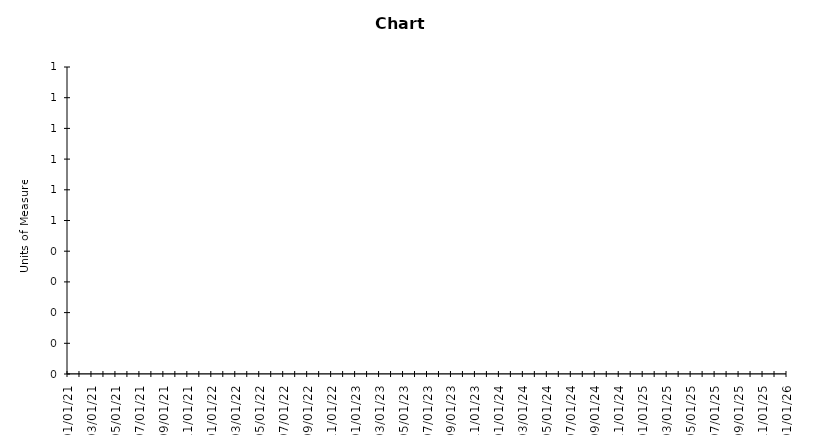
| Category | Data | Target |
|---|---|---|
| 2021-01-01 |  | 0 |
| 2021-02-01 |  | 0 |
| 2021-03-01 |  | 0 |
| 2021-04-01 |  | 0 |
| 2021-05-01 |  | 0 |
| 2021-06-01 |  | 0 |
| 2021-07-01 |  | 0 |
| 2021-08-01 |  | 0 |
| 2021-09-01 |  | 0 |
| 2021-10-01 |  | 0 |
| 2021-11-01 |  | 0 |
| 2021-12-01 |  | 0 |
| 2022-01-01 |  | 0 |
| 2022-02-01 |  | 0 |
| 2022-03-01 |  | 0 |
| 2022-04-01 |  | 0 |
| 2022-05-01 |  | 0 |
| 2022-06-01 |  | 0 |
| 2022-07-01 |  | 0 |
| 2022-08-01 |  | 0 |
| 2022-09-01 |  | 0 |
| 2022-10-01 |  | 0 |
| 2022-11-01 |  | 0 |
| 2022-12-01 |  | 0 |
| 2023-01-01 |  | 0 |
| 2023-02-01 |  | 0 |
| 2023-03-01 |  | 0 |
| 2023-04-01 |  | 0 |
| 2023-05-01 |  | 0 |
| 2023-06-01 |  | 0 |
| 2023-07-01 |  | 0 |
| 2023-08-01 |  | 0 |
| 2023-09-01 |  | 0 |
| 2023-10-01 |  | 0 |
| 2023-11-01 |  | 0 |
| 2023-12-01 |  | 0 |
| 2024-01-01 |  | 0 |
| 2024-02-01 |  | 0 |
| 2024-03-01 |  | 0 |
| 2024-04-01 |  | 0 |
| 2024-05-01 |  | 0 |
| 2024-06-01 |  | 0 |
| 2024-07-01 |  | 0 |
| 2024-08-01 |  | 0 |
| 2024-09-01 |  | 0 |
| 2024-10-01 |  | 0 |
| 2024-11-01 |  | 0 |
| 2024-12-01 |  | 0 |
| 2025-01-01 |  | 0 |
| 2025-02-01 |  | 0 |
| 2025-03-01 |  | 0 |
| 2025-04-01 |  | 0 |
| 2025-05-01 |  | 0 |
| 2025-06-01 |  | 0 |
| 2025-07-01 |  | 0 |
| 2025-08-01 |  | 0 |
| 2025-09-01 |  | 0 |
| 2025-10-01 |  | 0 |
| 2025-11-01 |  | 0 |
| 2025-12-01 |  | 0 |
| 2026-01-01 |  | 0 |